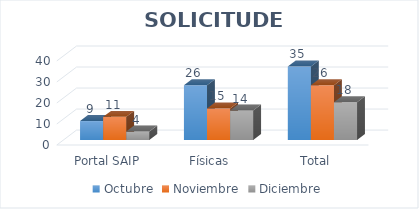
| Category | Octubre | Noviembre | Diciembre |
|---|---|---|---|
| Portal SAIP | 9 | 11 | 4 |
| Físicas  | 26 | 15 | 14 |
| Total | 35 | 26 | 18 |